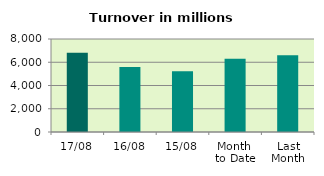
| Category | Series 0 |
|---|---|
| 17/08 | 6820.455 |
| 16/08 | 5594.463 |
| 15/08 | 5220.559 |
| Month 
to Date | 6294.625 |
| Last
Month | 6596.254 |